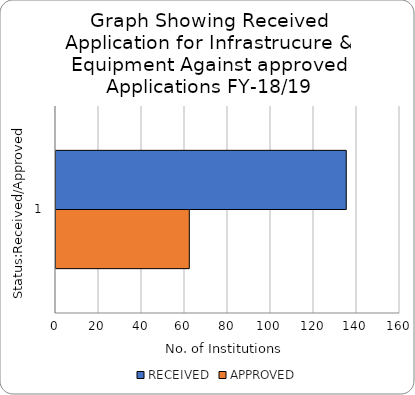
| Category | RECEIVED | APPROVED |
|---|---|---|
| 0 | 135 | 62 |